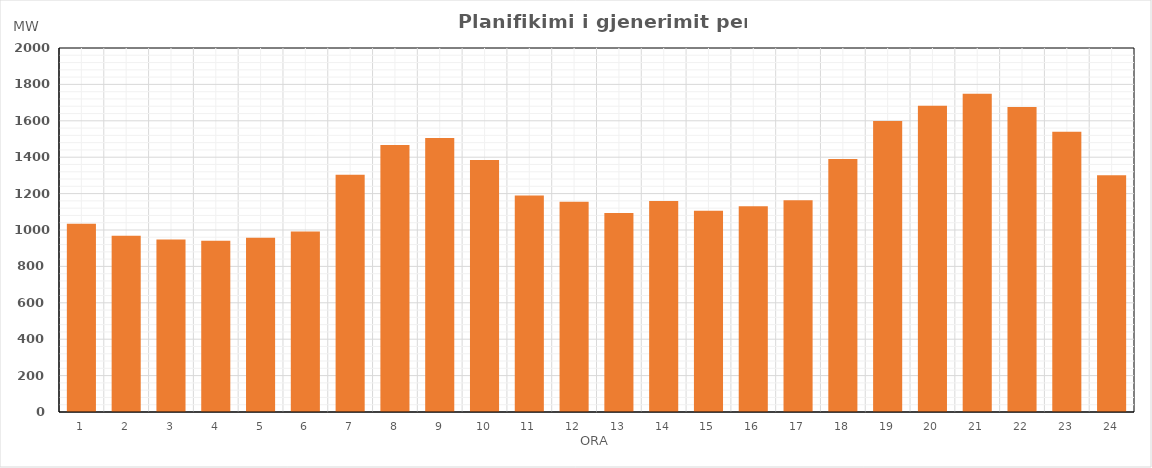
| Category | Max (MW) |
|---|---|
| 0 | 1034.96 |
| 1 | 968.34 |
| 2 | 947.83 |
| 3 | 940.73 |
| 4 | 957.73 |
| 5 | 992.13 |
| 6 | 1303.39 |
| 7 | 1467.34 |
| 8 | 1505.61 |
| 9 | 1384 |
| 10 | 1189.58 |
| 11 | 1154.9 |
| 12 | 1093.68 |
| 13 | 1159.85 |
| 14 | 1106.27 |
| 15 | 1130.73 |
| 16 | 1163.08 |
| 17 | 1389.8 |
| 18 | 1599.52 |
| 19 | 1682.75 |
| 20 | 1748.91 |
| 21 | 1675.41 |
| 22 | 1540.17 |
| 23 | 1301.27 |